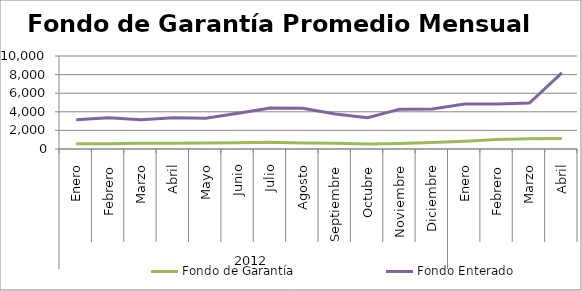
| Category | Fondo de Garantía | Fondo Enterado |
|---|---|---|
| 0 | 560.173 | 3141.641 |
| 1 | 575.916 | 3362.648 |
| 2 | 622.075 | 3154.118 |
| 3 | 612.299 | 3348.058 |
| 4 | 654.277 | 3308.859 |
| 5 | 675.965 | 3850.375 |
| 6 | 729.97 | 4400.539 |
| 7 | 649.095 | 4383.327 |
| 8 | 606.03 | 3757.632 |
| 9 | 525.314 | 3362.932 |
| 10 | 591.646 | 4285.609 |
| 11 | 703.403 | 4296.87 |
| 12 | 823.344 | 4842.786 |
| 13 | 1008.855 | 4845.136 |
| 14 | 1091.101 | 4938.365 |
| 15 | 1128.09 | 8179.666 |